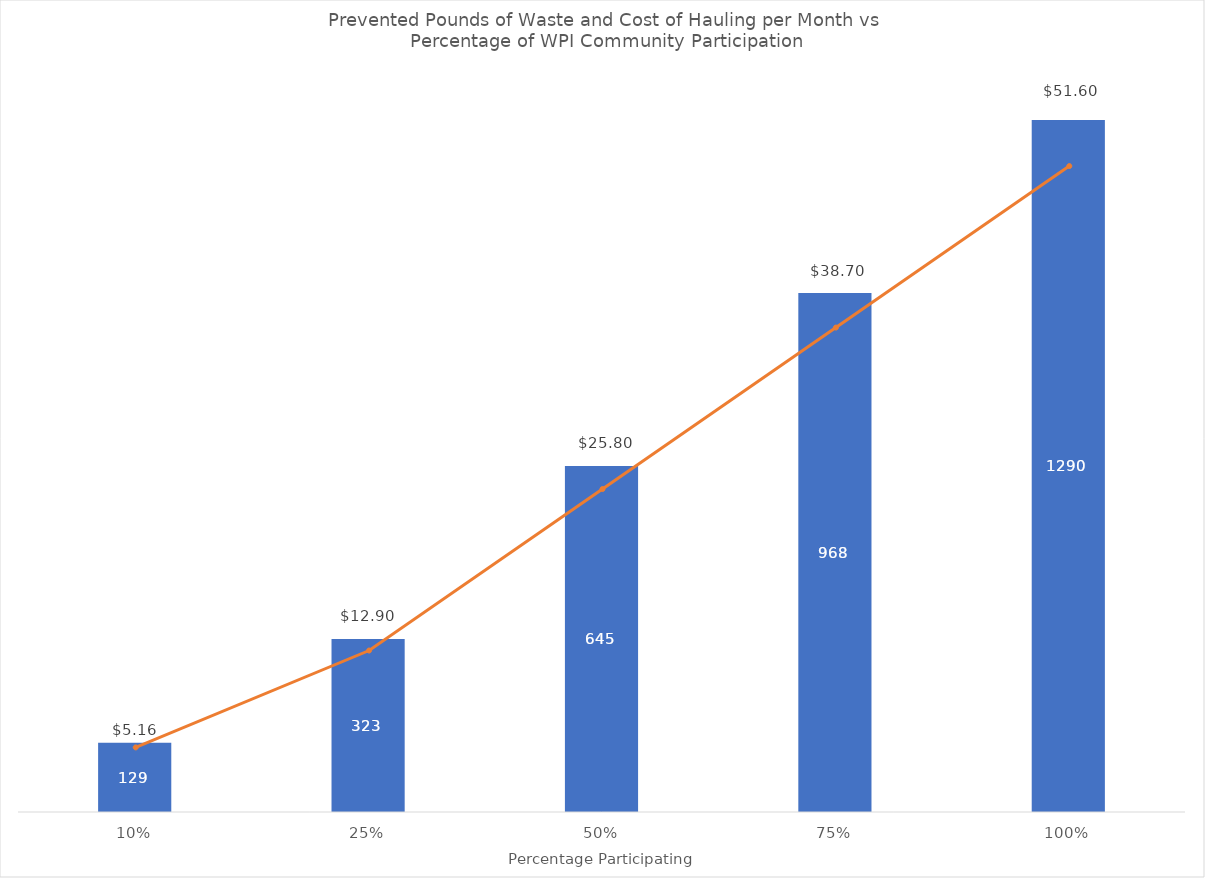
| Category | Pounds of Waste Prevented per Month |
|---|---|
| 0.1 | 129.01 |
| 0.25 | 322.525 |
| 0.5 | 645.05 |
| 0.75 | 967.575 |
| 1.0 | 1290.1 |